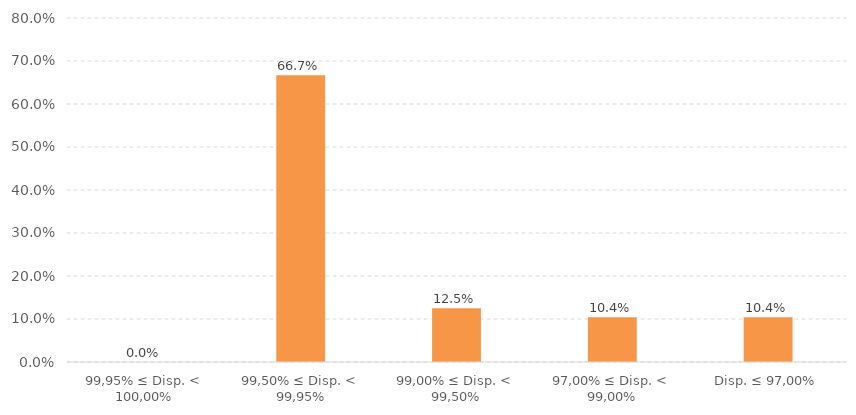
| Category | Series 0 |
|---|---|
| 99,95% ≤ Disp. < 100,00% | 0 |
| 99,50% ≤ Disp. < 99,95% | 0.667 |
| 99,00% ≤ Disp. < 99,50% | 0.125 |
| 97,00% ≤ Disp. < 99,00% | 0.104 |
| Disp. ≤ 97,00% | 0.104 |